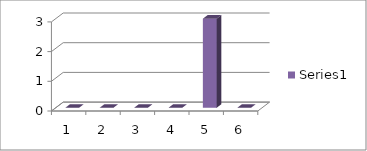
| Category | Series 0 |
|---|---|
| 0 | 0 |
| 1 | 0 |
| 2 | 0 |
| 3 | 0 |
| 4 | 3 |
| 5 | 0 |